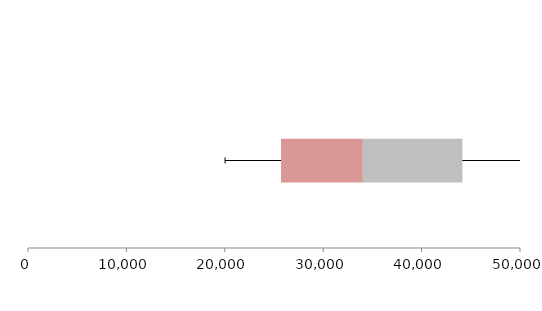
| Category | Series 1 | Series 2 | Series 3 |
|---|---|---|---|
| 0 | 25712.892 | 8316.664 | 10113.341 |